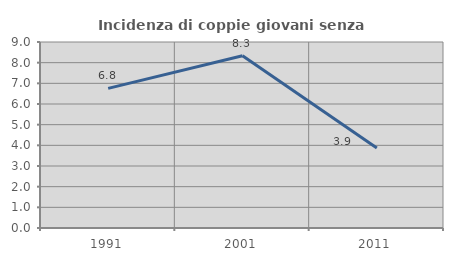
| Category | Incidenza di coppie giovani senza figli |
|---|---|
| 1991.0 | 6.757 |
| 2001.0 | 8.333 |
| 2011.0 | 3.871 |